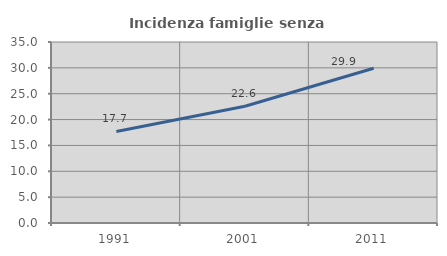
| Category | Incidenza famiglie senza nuclei |
|---|---|
| 1991.0 | 17.696 |
| 2001.0 | 22.577 |
| 2011.0 | 29.93 |